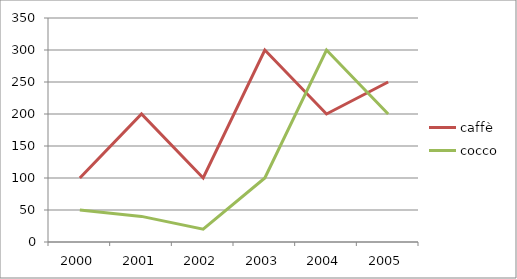
| Category | caffè | cocco |
|---|---|---|
| 2000.0 | 100 | 50 |
| 2001.0 | 200 | 40 |
| 2002.0 | 100 | 20 |
| 2003.0 | 300 | 100 |
| 2004.0 | 200 | 300 |
| 2005.0 | 250 | 200 |